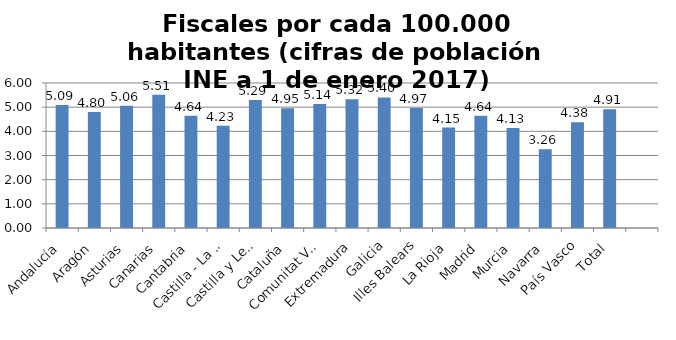
| Category | Fiscales por cada 100.000 habitantes |
|---|---|
| Andalucía | 5.093 |
| Aragón | 4.798 |
| Asturias | 5.06 |
| Canarias | 5.512 |
| Cantabria | 4.645 |
| Castilla - La Mancha | 4.231 |
| Castilla y León | 5.292 |
| Cataluña | 4.954 |
| Comunitat Valenciana | 5.135 |
| Extremadura | 5.325 |
| Galicia | 5.401 |
| Illes Balears | 4.97 |
| La Rioja | 4.155 |
| Madrid | 4.642 |
| Murcia | 4.134 |
| Navarra | 3.262 |
| País Vasco | 4.376 |
| Total | 4.914 |